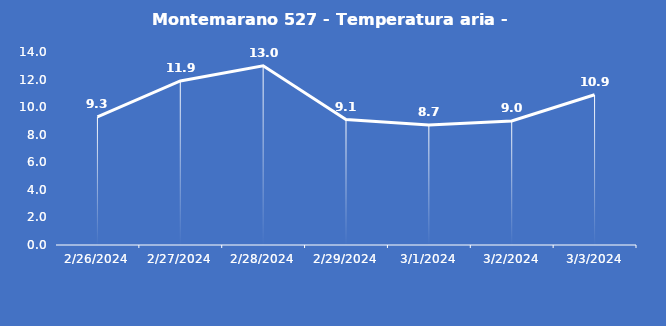
| Category | Montemarano 527 - Temperatura aria - Grezzo (°C) |
|---|---|
| 2/26/24 | 9.3 |
| 2/27/24 | 11.9 |
| 2/28/24 | 13 |
| 2/29/24 | 9.1 |
| 3/1/24 | 8.7 |
| 3/2/24 | 9 |
| 3/3/24 | 10.9 |